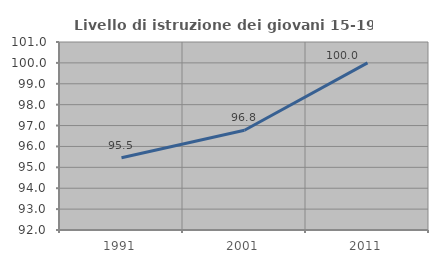
| Category | Livello di istruzione dei giovani 15-19 anni |
|---|---|
| 1991.0 | 95.455 |
| 2001.0 | 96.774 |
| 2011.0 | 100 |